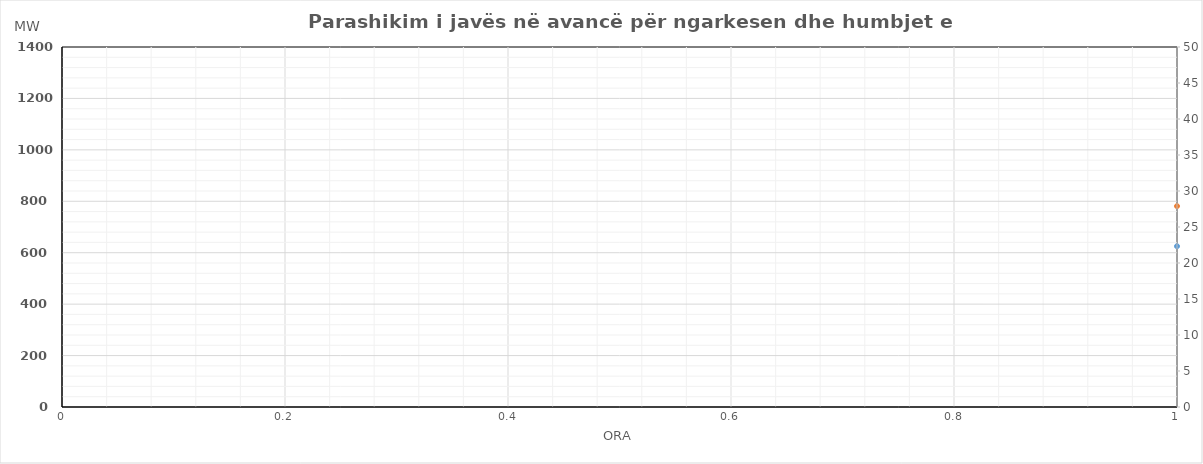
| Category | Ngarkesa (MWh) |
|---|---|
| 0 | 781.16 |
| 1 | 707.83 |
| 2 | 665.1 |
| 3 | 643.31 |
| 4 | 637.09 |
| 5 | 661.57 |
| 6 | 759.79 |
| 7 | 888.22 |
| 8 | 997.92 |
| 9 | 1054.92 |
| 10 | 1088.86 |
| 11 | 1124.65 |
| 12 | 1154.94 |
| 13 | 1176.52 |
| 14 | 1167.04 |
| 15 | 1156.89 |
| 16 | 1151.3 |
| 17 | 1175.84 |
| 18 | 1202.64 |
| 19 | 1202.32 |
| 20 | 1214.05 |
| 21 | 1206.35 |
| 22 | 1105.35 |
| 23 | 942.45 |
| 24 | 798.15 |
| 25 | 722.04 |
| 26 | 678.94 |
| 27 | 654.9 |
| 28 | 647 |
| 29 | 672.96 |
| 30 | 757.83 |
| 31 | 883.1 |
| 32 | 992.93 |
| 33 | 1045.5 |
| 34 | 1084.29 |
| 35 | 1135.14 |
| 36 | 1194.84 |
| 37 | 1219.45 |
| 38 | 1209.87 |
| 39 | 1208.13 |
| 40 | 1197.58 |
| 41 | 1221.84 |
| 42 | 1254.6 |
| 43 | 1262.69 |
| 44 | 1275.92 |
| 45 | 1249.14 |
| 46 | 1151.25 |
| 47 | 1003.23 |
| 48 | 839.7 |
| 49 | 765.2 |
| 50 | 723.4 |
| 51 | 698.07 |
| 52 | 690.57 |
| 53 | 707.24 |
| 54 | 769.14 |
| 55 | 896.92 |
| 56 | 1009.86 |
| 57 | 1066.06 |
| 58 | 1187.47 |
| 59 | 1199.67 |
| 60 | 1210.97 |
| 61 | 1239.9 |
| 62 | 1227.92 |
| 63 | 1161.97 |
| 64 | 1158.24 |
| 65 | 1141.96 |
| 66 | 1175.22 |
| 67 | 1169.8 |
| 68 | 1179.08 |
| 69 | 1166.26 |
| 70 | 1084.03 |
| 71 | 928.64 |
| 72 | 767.54 |
| 73 | 689.41 |
| 74 | 649.6 |
| 75 | 632.79 |
| 76 | 632.88 |
| 77 | 671.27 |
| 78 | 776.24 |
| 79 | 926.36 |
| 80 | 1012.36 |
| 81 | 1050.06 |
| 82 | 1054.16 |
| 83 | 1061.76 |
| 84 | 1083.16 |
| 85 | 1037.96 |
| 86 | 1028.46 |
| 87 | 1026.96 |
| 88 | 1027.66 |
| 89 | 1051.86 |
| 90 | 1087.26 |
| 91 | 1088.16 |
| 92 | 1117.77 |
| 93 | 1111.37 |
| 94 | 1013.77 |
| 95 | 864.07 |
| 96 | 759.33 |
| 97 | 685.03 |
| 98 | 652.85 |
| 99 | 637.41 |
| 100 | 639.34 |
| 101 | 672.4 |
| 102 | 752.21 |
| 103 | 880.62 |
| 104 | 983.16 |
| 105 | 1019.05 |
| 106 | 955.53 |
| 107 | 976.38 |
| 108 | 989.09 |
| 109 | 1006.3 |
| 110 | 960.99 |
| 111 | 944.37 |
| 112 | 935.08 |
| 113 | 959.75 |
| 114 | 985.95 |
| 115 | 994.7 |
| 116 | 1026.23 |
| 117 | 1028.76 |
| 118 | 922.85 |
| 119 | 786.4 |
| 120 | 706.3 |
| 121 | 633.42 |
| 122 | 599.86 |
| 123 | 581.68 |
| 124 | 582.18 |
| 125 | 606.86 |
| 126 | 688.22 |
| 127 | 797.61 |
| 128 | 891.22 |
| 129 | 939.72 |
| 130 | 958 |
| 131 | 976.02 |
| 132 | 981.49 |
| 133 | 997.18 |
| 134 | 979.75 |
| 135 | 960.96 |
| 136 | 969.59 |
| 137 | 994.12 |
| 138 | 1031.19 |
| 139 | 1039.59 |
| 140 | 1062.46 |
| 141 | 1052.06 |
| 142 | 954.03 |
| 143 | 828.91 |
| 144 | 708.6 |
| 145 | 639.42 |
| 146 | 603.46 |
| 147 | 585.88 |
| 148 | 583.58 |
| 149 | 602.26 |
| 150 | 670.82 |
| 151 | 744.81 |
| 152 | 811.82 |
| 153 | 841.92 |
| 154 | 866.1 |
| 155 | 884.12 |
| 156 | 904.29 |
| 157 | 910.18 |
| 158 | 883.75 |
| 159 | 879.96 |
| 160 | 914.69 |
| 161 | 958.32 |
| 162 | 1009.49 |
| 163 | 1028.09 |
| 164 | 1056.66 |
| 165 | 1061.56 |
| 166 | 962.93 |
| 167 | 828.11 |